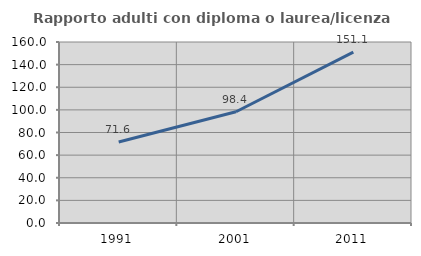
| Category | Rapporto adulti con diploma o laurea/licenza media  |
|---|---|
| 1991.0 | 71.6 |
| 2001.0 | 98.355 |
| 2011.0 | 151.064 |